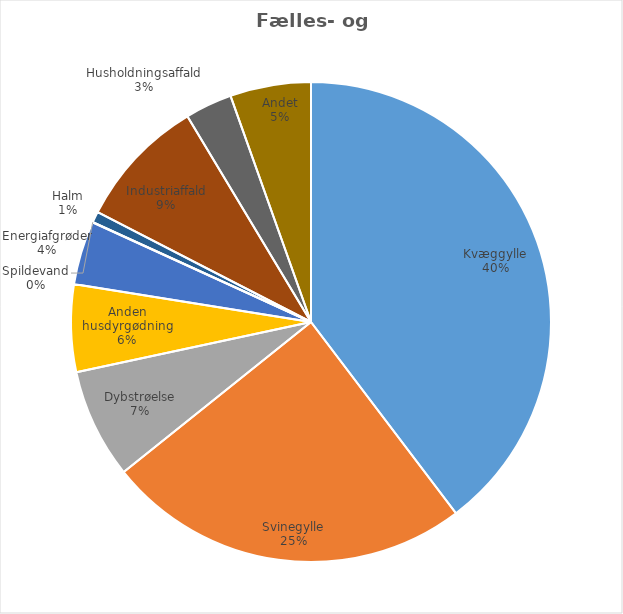
| Category | Series 0 |
|---|---|
| Kvæggylle | 4634041.17 |
| Svinegylle | 2870527.8 |
| Dybstrøelse | 862883.52 |
| Anden husdyrgødning | 687818.89 |
| Energiafgrøder | 500352.02 |
| Spildevand | 3098 |
| Halm | 85689.6 |
| Industriaffald | 1029875.42 |
| Husholdningsaffald | 370119.1 |
| Andet | 635776.78 |